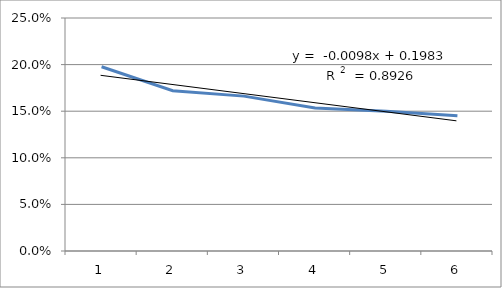
| Category | Canterbury |
|---|---|
| 0 | 0.198 |
| 1 | 0.172 |
| 2 | 0.166 |
| 3 | 0.153 |
| 4 | 0.15 |
| 5 | 0.145 |